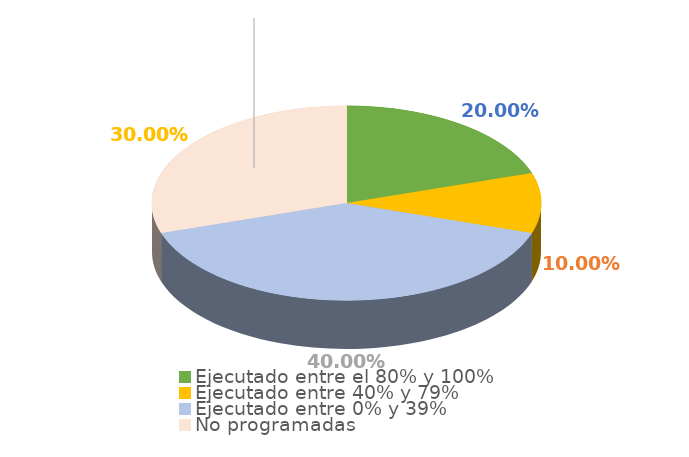
| Category | Series 0 |
|---|---|
| Ejecutado entre el 80% y 100% | 0.2 |
| Ejecutado entre 40% y 79% | 0.1 |
| Ejecutado entre 0% y 39% | 0.4 |
| No programadas | 0.3 |